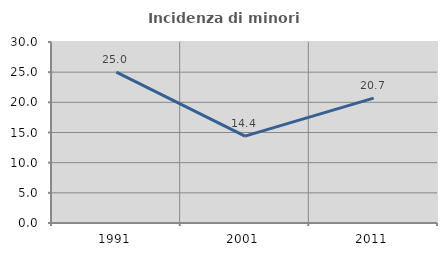
| Category | Incidenza di minori stranieri |
|---|---|
| 1991.0 | 25 |
| 2001.0 | 14.4 |
| 2011.0 | 20.69 |